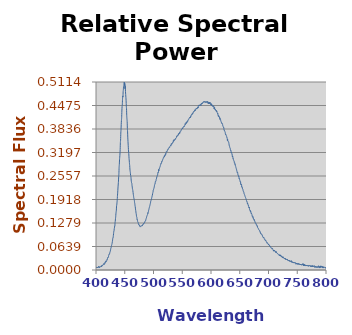
| Category | Scan 719 |
|---|---|
| 349.634 | 0.006 |
| 350.013 | 0.014 |
| 350.392 | 0.012 |
| 350.77 | 0.006 |
| 351.149 | 0.006 |
| 351.527 | 0.014 |
| 351.906 | 0.012 |
| 352.284 | 0.007 |
| 352.663 | 0.008 |
| 353.041 | 0.006 |
| 353.419 | 0.012 |
| 353.798 | 0.014 |
| 354.176 | 0.013 |
| 354.554 | 0.016 |
| 354.932 | 0.013 |
| 355.311 | 0.012 |
| 355.689 | 0.016 |
| 356.067 | 0.011 |
| 356.445 | 0.009 |
| 356.823 | 0.01 |
| 357.201 | 0.011 |
| 357.579 | 0.01 |
| 357.957 | 0.008 |
| 358.335 | 0.015 |
| 358.713 | 0.013 |
| 359.09 | 0.016 |
| 359.468 | 0.016 |
| 359.846 | 0.009 |
| 360.224 | 0.011 |
| 360.601 | 0.011 |
| 360.979 | 0.01 |
| 361.356 | 0.01 |
| 361.734 | 0.014 |
| 362.112 | 0.013 |
| 362.489 | 0.01 |
| 362.866 | 0.013 |
| 363.244 | 0.01 |
| 363.621 | 0.011 |
| 363.999 | 0.01 |
| 364.376 | 0.012 |
| 364.753 | 0.009 |
| 365.13 | 0.005 |
| 365.507 | 0.011 |
| 365.885 | 0.011 |
| 366.262 | 0.012 |
| 366.639 | 0.01 |
| 367.016 | 0.01 |
| 367.393 | 0.007 |
| 367.77 | 0.006 |
| 368.147 | 0.011 |
| 368.524 | 0.013 |
| 368.9 | 0.012 |
| 369.277 | 0.008 |
| 369.654 | 0.007 |
| 370.031 | 0.013 |
| 370.407 | 0.011 |
| 370.784 | 0.01 |
| 371.161 | 0.01 |
| 371.537 | 0.013 |
| 371.914 | 0.013 |
| 372.29 | 0.009 |
| 372.667 | 0.008 |
| 373.043 | 0.008 |
| 373.42 | 0.008 |
| 373.796 | 0.014 |
| 374.172 | 0.011 |
| 374.549 | 0.01 |
| 374.925 | 0.006 |
| 375.301 | 0.01 |
| 375.677 | 0.007 |
| 376.054 | 0.009 |
| 376.43 | 0.006 |
| 376.806 | 0.009 |
| 377.182 | 0.007 |
| 377.558 | 0.009 |
| 377.934 | 0.01 |
| 378.31 | 0.01 |
| 378.686 | 0.011 |
| 379.061 | 0.009 |
| 379.437 | 0.01 |
| 379.813 | 0.008 |
| 380.189 | 0.007 |
| 380.564 | 0.007 |
| 380.94 | 0.009 |
| 381.316 | 0.007 |
| 381.691 | 0.009 |
| 382.067 | 0.008 |
| 382.442 | 0.008 |
| 382.818 | 0.007 |
| 383.193 | 0.009 |
| 383.569 | 0.006 |
| 383.944 | 0.006 |
| 384.319 | 0.005 |
| 384.695 | 0.008 |
| 385.07 | 0.006 |
| 385.445 | 0.008 |
| 385.82 | 0.008 |
| 386.195 | 0.006 |
| 386.571 | 0.009 |
| 386.946 | 0.009 |
| 387.321 | 0.008 |
| 387.696 | 0.006 |
| 388.071 | 0.007 |
| 388.446 | 0.007 |
| 388.82 | 0.006 |
| 389.195 | 0.005 |
| 389.57 | 0.008 |
| 389.945 | 0.007 |
| 390.32 | 0.007 |
| 390.694 | 0.008 |
| 391.069 | 0.007 |
| 391.443 | 0.006 |
| 391.818 | 0.006 |
| 392.193 | 0.007 |
| 392.567 | 0.008 |
| 392.942 | 0.008 |
| 393.316 | 0.007 |
| 393.69 | 0.006 |
| 394.065 | 0.006 |
| 394.439 | 0.004 |
| 394.813 | 0.005 |
| 395.188 | 0.006 |
| 395.562 | 0.006 |
| 395.936 | 0.009 |
| 396.31 | 0.005 |
| 396.684 | 0.005 |
| 397.058 | 0.007 |
| 397.432 | 0.007 |
| 397.806 | 0.008 |
| 398.18 | 0.006 |
| 398.554 | 0.008 |
| 398.928 | 0.009 |
| 399.302 | 0.008 |
| 399.675 | 0.006 |
| 400.049 | 0.008 |
| 400.423 | 0.007 |
| 400.797 | 0.008 |
| 401.17 | 0.006 |
| 401.544 | 0.008 |
| 401.917 | 0.007 |
| 402.291 | 0.008 |
| 402.664 | 0.007 |
| 403.038 | 0.007 |
| 403.411 | 0.006 |
| 403.785 | 0.008 |
| 404.158 | 0.007 |
| 404.531 | 0.01 |
| 404.905 | 0.008 |
| 405.278 | 0.008 |
| 405.651 | 0.009 |
| 406.024 | 0.006 |
| 406.397 | 0.008 |
| 406.77 | 0.009 |
| 407.143 | 0.008 |
| 407.516 | 0.008 |
| 407.889 | 0.009 |
| 408.262 | 0.01 |
| 408.635 | 0.011 |
| 409.008 | 0.011 |
| 409.381 | 0.009 |
| 409.753 | 0.008 |
| 410.126 | 0.013 |
| 410.499 | 0.012 |
| 410.871 | 0.013 |
| 411.244 | 0.012 |
| 411.617 | 0.013 |
| 411.989 | 0.014 |
| 412.362 | 0.014 |
| 412.734 | 0.016 |
| 413.106 | 0.015 |
| 413.479 | 0.017 |
| 413.851 | 0.017 |
| 414.223 | 0.016 |
| 414.596 | 0.015 |
| 414.968 | 0.017 |
| 415.34 | 0.02 |
| 415.712 | 0.018 |
| 416.084 | 0.02 |
| 416.456 | 0.023 |
| 416.829 | 0.021 |
| 417.201 | 0.022 |
| 417.572 | 0.025 |
| 417.944 | 0.023 |
| 418.316 | 0.025 |
| 418.688 | 0.025 |
| 419.06 | 0.028 |
| 419.432 | 0.027 |
| 419.803 | 0.03 |
| 420.175 | 0.032 |
| 420.547 | 0.034 |
| 420.918 | 0.033 |
| 421.29 | 0.034 |
| 421.661 | 0.036 |
| 422.033 | 0.04 |
| 422.404 | 0.041 |
| 422.776 | 0.043 |
| 423.147 | 0.043 |
| 423.519 | 0.046 |
| 423.89 | 0.045 |
| 424.261 | 0.049 |
| 424.632 | 0.05 |
| 425.004 | 0.052 |
| 425.375 | 0.055 |
| 425.746 | 0.059 |
| 426.117 | 0.059 |
| 426.488 | 0.063 |
| 426.859 | 0.065 |
| 427.23 | 0.069 |
| 427.601 | 0.069 |
| 427.972 | 0.072 |
| 428.342 | 0.076 |
| 428.713 | 0.079 |
| 429.084 | 0.085 |
| 429.455 | 0.088 |
| 429.825 | 0.088 |
| 430.196 | 0.094 |
| 430.567 | 0.099 |
| 430.937 | 0.105 |
| 431.308 | 0.105 |
| 431.678 | 0.112 |
| 432.049 | 0.115 |
| 432.419 | 0.12 |
| 432.79 | 0.12 |
| 433.16 | 0.129 |
| 433.53 | 0.133 |
| 433.9 | 0.14 |
| 434.271 | 0.145 |
| 434.641 | 0.153 |
| 435.011 | 0.158 |
| 435.381 | 0.163 |
| 435.751 | 0.174 |
| 436.121 | 0.177 |
| 436.491 | 0.183 |
| 436.861 | 0.189 |
| 437.231 | 0.2 |
| 437.601 | 0.207 |
| 437.971 | 0.217 |
| 438.34 | 0.226 |
| 438.71 | 0.234 |
| 439.08 | 0.242 |
| 439.45 | 0.253 |
| 439.819 | 0.262 |
| 440.189 | 0.279 |
| 440.558 | 0.287 |
| 440.928 | 0.3 |
| 441.297 | 0.307 |
| 441.667 | 0.316 |
| 442.036 | 0.328 |
| 442.406 | 0.347 |
| 442.775 | 0.354 |
| 443.144 | 0.373 |
| 443.513 | 0.382 |
| 443.883 | 0.396 |
| 444.252 | 0.407 |
| 444.621 | 0.415 |
| 444.99 | 0.432 |
| 445.359 | 0.444 |
| 445.728 | 0.449 |
| 446.097 | 0.464 |
| 446.466 | 0.473 |
| 446.835 | 0.471 |
| 447.204 | 0.485 |
| 447.573 | 0.49 |
| 447.941 | 0.498 |
| 448.31 | 0.497 |
| 448.679 | 0.507 |
| 449.047 | 0.511 |
| 449.416 | 0.511 |
| 449.785 | 0.502 |
| 450.153 | 0.507 |
| 450.522 | 0.493 |
| 450.89 | 0.501 |
| 451.258 | 0.486 |
| 451.627 | 0.478 |
| 451.995 | 0.47 |
| 452.363 | 0.46 |
| 452.732 | 0.446 |
| 453.1 | 0.439 |
| 453.468 | 0.42 |
| 453.836 | 0.411 |
| 454.204 | 0.404 |
| 454.572 | 0.385 |
| 454.941 | 0.376 |
| 455.309 | 0.359 |
| 455.676 | 0.349 |
| 456.044 | 0.338 |
| 456.412 | 0.328 |
| 456.78 | 0.32 |
| 457.148 | 0.313 |
| 457.516 | 0.303 |
| 457.883 | 0.297 |
| 458.251 | 0.289 |
| 458.619 | 0.284 |
| 458.986 | 0.275 |
| 459.354 | 0.269 |
| 459.721 | 0.265 |
| 460.089 | 0.258 |
| 460.456 | 0.256 |
| 460.824 | 0.252 |
| 461.191 | 0.245 |
| 461.558 | 0.24 |
| 461.925 | 0.237 |
| 462.293 | 0.235 |
| 462.66 | 0.23 |
| 463.027 | 0.226 |
| 463.394 | 0.221 |
| 463.761 | 0.219 |
| 464.128 | 0.216 |
| 464.495 | 0.211 |
| 464.862 | 0.206 |
| 465.229 | 0.202 |
| 465.596 | 0.197 |
| 465.963 | 0.195 |
| 466.33 | 0.193 |
| 466.696 | 0.189 |
| 467.063 | 0.184 |
| 467.43 | 0.181 |
| 467.796 | 0.176 |
| 468.163 | 0.173 |
| 468.53 | 0.168 |
| 468.896 | 0.163 |
| 469.263 | 0.16 |
| 469.629 | 0.155 |
| 469.995 | 0.153 |
| 470.362 | 0.147 |
| 470.728 | 0.144 |
| 471.094 | 0.143 |
| 471.461 | 0.137 |
| 471.827 | 0.137 |
| 472.193 | 0.134 |
| 472.559 | 0.131 |
| 472.925 | 0.13 |
| 473.291 | 0.129 |
| 473.657 | 0.127 |
| 474.023 | 0.125 |
| 474.389 | 0.123 |
| 474.755 | 0.123 |
| 475.121 | 0.122 |
| 475.487 | 0.121 |
| 475.852 | 0.122 |
| 476.218 | 0.119 |
| 476.584 | 0.118 |
| 476.949 | 0.118 |
| 477.315 | 0.117 |
| 477.68 | 0.118 |
| 478.046 | 0.119 |
| 478.411 | 0.12 |
| 478.777 | 0.12 |
| 479.142 | 0.119 |
| 479.508 | 0.12 |
| 479.873 | 0.121 |
| 480.238 | 0.12 |
| 480.603 | 0.12 |
| 480.969 | 0.123 |
| 481.334 | 0.124 |
| 481.699 | 0.123 |
| 482.064 | 0.124 |
| 482.429 | 0.125 |
| 482.794 | 0.127 |
| 483.159 | 0.126 |
| 483.524 | 0.127 |
| 483.889 | 0.128 |
| 484.254 | 0.129 |
| 484.618 | 0.129 |
| 484.983 | 0.131 |
| 485.348 | 0.133 |
| 485.712 | 0.134 |
| 486.077 | 0.135 |
| 486.442 | 0.134 |
| 486.806 | 0.138 |
| 487.171 | 0.14 |
| 487.535 | 0.141 |
| 487.9 | 0.143 |
| 488.264 | 0.146 |
| 488.628 | 0.148 |
| 488.993 | 0.148 |
| 489.357 | 0.15 |
| 489.721 | 0.151 |
| 490.085 | 0.156 |
| 490.449 | 0.154 |
| 490.814 | 0.158 |
| 491.178 | 0.159 |
| 491.542 | 0.162 |
| 491.906 | 0.164 |
| 492.27 | 0.167 |
| 492.633 | 0.169 |
| 492.997 | 0.172 |
| 493.361 | 0.173 |
| 493.725 | 0.176 |
| 494.089 | 0.178 |
| 494.452 | 0.181 |
| 494.816 | 0.183 |
| 495.18 | 0.187 |
| 495.543 | 0.189 |
| 495.907 | 0.19 |
| 496.27 | 0.191 |
| 496.634 | 0.195 |
| 496.997 | 0.197 |
| 497.36 | 0.199 |
| 497.724 | 0.202 |
| 498.087 | 0.204 |
| 498.45 | 0.207 |
| 498.813 | 0.211 |
| 499.177 | 0.212 |
| 499.54 | 0.217 |
| 499.903 | 0.218 |
| 500.266 | 0.221 |
| 500.629 | 0.221 |
| 500.992 | 0.224 |
| 501.355 | 0.226 |
| 501.718 | 0.23 |
| 502.08 | 0.232 |
| 502.443 | 0.235 |
| 502.806 | 0.235 |
| 503.169 | 0.24 |
| 503.531 | 0.24 |
| 503.894 | 0.241 |
| 504.257 | 0.242 |
| 504.619 | 0.246 |
| 504.982 | 0.248 |
| 505.344 | 0.25 |
| 505.707 | 0.253 |
| 506.069 | 0.254 |
| 506.431 | 0.256 |
| 506.794 | 0.258 |
| 507.156 | 0.259 |
| 507.518 | 0.263 |
| 507.88 | 0.266 |
| 508.242 | 0.266 |
| 508.605 | 0.266 |
| 508.967 | 0.273 |
| 509.329 | 0.27 |
| 509.691 | 0.275 |
| 510.052 | 0.275 |
| 510.414 | 0.276 |
| 510.776 | 0.279 |
| 511.138 | 0.28 |
| 511.5 | 0.282 |
| 511.862 | 0.284 |
| 512.223 | 0.285 |
| 512.585 | 0.288 |
| 512.946 | 0.29 |
| 513.308 | 0.289 |
| 513.67 | 0.291 |
| 514.031 | 0.291 |
| 514.392 | 0.296 |
| 514.754 | 0.295 |
| 515.115 | 0.298 |
| 515.477 | 0.297 |
| 515.838 | 0.299 |
| 516.199 | 0.301 |
| 516.56 | 0.302 |
| 516.921 | 0.304 |
| 517.282 | 0.306 |
| 517.644 | 0.306 |
| 518.005 | 0.306 |
| 518.366 | 0.307 |
| 518.727 | 0.31 |
| 519.087 | 0.308 |
| 519.448 | 0.31 |
| 519.809 | 0.313 |
| 520.17 | 0.311 |
| 520.531 | 0.314 |
| 520.891 | 0.316 |
| 521.252 | 0.314 |
| 521.613 | 0.317 |
| 521.973 | 0.319 |
| 522.334 | 0.322 |
| 522.694 | 0.321 |
| 523.055 | 0.322 |
| 523.415 | 0.322 |
| 523.775 | 0.323 |
| 524.136 | 0.325 |
| 524.496 | 0.327 |
| 524.856 | 0.327 |
| 525.216 | 0.327 |
| 525.577 | 0.329 |
| 525.937 | 0.331 |
| 526.297 | 0.332 |
| 526.657 | 0.331 |
| 527.017 | 0.331 |
| 527.377 | 0.333 |
| 527.737 | 0.335 |
| 528.096 | 0.334 |
| 528.456 | 0.336 |
| 528.816 | 0.337 |
| 529.176 | 0.338 |
| 529.535 | 0.339 |
| 529.895 | 0.338 |
| 530.255 | 0.337 |
| 530.614 | 0.341 |
| 530.974 | 0.343 |
| 531.333 | 0.342 |
| 531.693 | 0.344 |
| 532.052 | 0.342 |
| 532.411 | 0.344 |
| 532.771 | 0.346 |
| 533.13 | 0.346 |
| 533.489 | 0.348 |
| 533.849 | 0.348 |
| 534.208 | 0.348 |
| 534.567 | 0.352 |
| 534.926 | 0.35 |
| 535.285 | 0.351 |
| 535.644 | 0.355 |
| 536.003 | 0.354 |
| 536.362 | 0.353 |
| 536.721 | 0.353 |
| 537.079 | 0.355 |
| 537.438 | 0.357 |
| 537.797 | 0.356 |
| 538.156 | 0.356 |
| 538.514 | 0.359 |
| 538.873 | 0.358 |
| 539.231 | 0.359 |
| 539.59 | 0.36 |
| 539.948 | 0.361 |
| 540.307 | 0.364 |
| 540.665 | 0.362 |
| 541.024 | 0.365 |
| 541.382 | 0.365 |
| 541.74 | 0.366 |
| 542.098 | 0.365 |
| 542.457 | 0.367 |
| 542.815 | 0.367 |
| 543.173 | 0.37 |
| 543.531 | 0.369 |
| 543.889 | 0.371 |
| 544.247 | 0.37 |
| 544.605 | 0.372 |
| 544.963 | 0.371 |
| 545.32 | 0.374 |
| 545.678 | 0.372 |
| 546.036 | 0.374 |
| 546.394 | 0.376 |
| 546.751 | 0.378 |
| 547.109 | 0.379 |
| 547.467 | 0.378 |
| 547.824 | 0.379 |
| 548.182 | 0.38 |
| 548.539 | 0.383 |
| 548.897 | 0.382 |
| 549.254 | 0.383 |
| 549.611 | 0.383 |
| 549.969 | 0.385 |
| 550.326 | 0.387 |
| 550.683 | 0.384 |
| 551.04 | 0.387 |
| 551.397 | 0.387 |
| 551.754 | 0.388 |
| 552.111 | 0.389 |
| 552.468 | 0.389 |
| 552.825 | 0.391 |
| 553.182 | 0.391 |
| 553.539 | 0.39 |
| 553.896 | 0.392 |
| 554.253 | 0.393 |
| 554.61 | 0.395 |
| 554.966 | 0.398 |
| 555.323 | 0.398 |
| 555.68 | 0.396 |
| 556.036 | 0.398 |
| 556.393 | 0.398 |
| 556.749 | 0.402 |
| 557.106 | 0.399 |
| 557.462 | 0.401 |
| 557.818 | 0.4 |
| 558.175 | 0.404 |
| 558.531 | 0.404 |
| 558.887 | 0.403 |
| 559.243 | 0.403 |
| 559.599 | 0.407 |
| 559.956 | 0.408 |
| 560.312 | 0.407 |
| 560.668 | 0.409 |
| 561.024 | 0.41 |
| 561.38 | 0.41 |
| 561.735 | 0.411 |
| 562.091 | 0.413 |
| 562.447 | 0.414 |
| 562.803 | 0.415 |
| 563.159 | 0.414 |
| 563.514 | 0.415 |
| 563.87 | 0.416 |
| 564.225 | 0.414 |
| 564.581 | 0.419 |
| 564.936 | 0.419 |
| 565.292 | 0.418 |
| 565.647 | 0.422 |
| 566.003 | 0.423 |
| 566.358 | 0.424 |
| 566.713 | 0.423 |
| 567.069 | 0.425 |
| 567.424 | 0.425 |
| 567.779 | 0.424 |
| 568.134 | 0.427 |
| 568.489 | 0.426 |
| 568.844 | 0.426 |
| 569.199 | 0.428 |
| 569.554 | 0.431 |
| 569.909 | 0.431 |
| 570.264 | 0.432 |
| 570.619 | 0.431 |
| 570.973 | 0.431 |
| 571.328 | 0.432 |
| 571.683 | 0.435 |
| 572.038 | 0.436 |
| 572.392 | 0.433 |
| 572.747 | 0.435 |
| 573.101 | 0.437 |
| 573.456 | 0.436 |
| 573.81 | 0.439 |
| 574.164 | 0.438 |
| 574.519 | 0.438 |
| 574.873 | 0.441 |
| 575.227 | 0.44 |
| 575.582 | 0.439 |
| 575.936 | 0.439 |
| 576.29 | 0.44 |
| 576.644 | 0.442 |
| 576.998 | 0.443 |
| 577.352 | 0.443 |
| 577.706 | 0.441 |
| 578.06 | 0.446 |
| 578.414 | 0.448 |
| 578.768 | 0.447 |
| 579.121 | 0.448 |
| 579.475 | 0.448 |
| 579.829 | 0.449 |
| 580.182 | 0.449 |
| 580.536 | 0.446 |
| 580.89 | 0.449 |
| 581.243 | 0.45 |
| 581.597 | 0.45 |
| 581.95 | 0.451 |
| 582.303 | 0.449 |
| 582.657 | 0.448 |
| 583.01 | 0.452 |
| 583.363 | 0.453 |
| 583.716 | 0.452 |
| 584.07 | 0.454 |
| 584.423 | 0.454 |
| 584.776 | 0.452 |
| 585.129 | 0.454 |
| 585.482 | 0.455 |
| 585.835 | 0.455 |
| 586.188 | 0.456 |
| 586.541 | 0.457 |
| 586.893 | 0.457 |
| 587.246 | 0.456 |
| 587.599 | 0.459 |
| 587.952 | 0.457 |
| 588.304 | 0.456 |
| 588.657 | 0.458 |
| 589.009 | 0.459 |
| 589.362 | 0.458 |
| 589.714 | 0.458 |
| 590.067 | 0.458 |
| 590.419 | 0.455 |
| 590.772 | 0.456 |
| 591.124 | 0.458 |
| 591.476 | 0.458 |
| 591.828 | 0.459 |
| 592.181 | 0.458 |
| 592.533 | 0.455 |
| 592.885 | 0.457 |
| 593.237 | 0.458 |
| 593.589 | 0.458 |
| 593.941 | 0.459 |
| 594.293 | 0.459 |
| 594.645 | 0.453 |
| 594.996 | 0.457 |
| 595.348 | 0.455 |
| 595.7 | 0.453 |
| 596.052 | 0.452 |
| 596.403 | 0.455 |
| 596.755 | 0.452 |
| 597.106 | 0.455 |
| 597.458 | 0.454 |
| 597.809 | 0.456 |
| 598.161 | 0.453 |
| 598.512 | 0.456 |
| 598.863 | 0.454 |
| 599.215 | 0.45 |
| 599.566 | 0.451 |
| 599.917 | 0.45 |
| 600.268 | 0.449 |
| 600.619 | 0.453 |
| 600.971 | 0.451 |
| 601.322 | 0.447 |
| 601.672 | 0.45 |
| 602.023 | 0.448 |
| 602.374 | 0.447 |
| 602.725 | 0.446 |
| 603.076 | 0.447 |
| 603.427 | 0.444 |
| 603.777 | 0.445 |
| 604.128 | 0.445 |
| 604.479 | 0.447 |
| 604.829 | 0.446 |
| 605.18 | 0.439 |
| 605.53 | 0.441 |
| 605.881 | 0.439 |
| 606.231 | 0.442 |
| 606.582 | 0.438 |
| 606.932 | 0.438 |
| 607.282 | 0.436 |
| 607.632 | 0.437 |
| 607.983 | 0.435 |
| 608.333 | 0.433 |
| 608.683 | 0.433 |
| 609.033 | 0.433 |
| 609.383 | 0.434 |
| 609.733 | 0.431 |
| 610.083 | 0.433 |
| 610.433 | 0.429 |
| 610.783 | 0.428 |
| 611.132 | 0.428 |
| 611.482 | 0.425 |
| 611.832 | 0.426 |
| 612.181 | 0.421 |
| 612.531 | 0.42 |
| 612.881 | 0.418 |
| 613.23 | 0.42 |
| 613.58 | 0.418 |
| 613.929 | 0.419 |
| 614.278 | 0.417 |
| 614.628 | 0.415 |
| 614.977 | 0.416 |
| 615.326 | 0.41 |
| 615.676 | 0.41 |
| 616.025 | 0.412 |
| 616.374 | 0.41 |
| 616.723 | 0.409 |
| 617.072 | 0.405 |
| 617.421 | 0.404 |
| 617.77 | 0.404 |
| 618.119 | 0.401 |
| 618.468 | 0.401 |
| 618.816 | 0.398 |
| 619.165 | 0.399 |
| 619.514 | 0.398 |
| 619.863 | 0.398 |
| 620.211 | 0.395 |
| 620.56 | 0.392 |
| 620.908 | 0.391 |
| 621.257 | 0.389 |
| 621.605 | 0.389 |
| 621.954 | 0.387 |
| 622.302 | 0.387 |
| 622.65 | 0.382 |
| 622.999 | 0.38 |
| 623.347 | 0.38 |
| 623.695 | 0.378 |
| 624.043 | 0.377 |
| 624.391 | 0.376 |
| 624.739 | 0.374 |
| 625.087 | 0.37 |
| 625.435 | 0.368 |
| 625.783 | 0.369 |
| 626.131 | 0.367 |
| 626.479 | 0.366 |
| 626.827 | 0.364 |
| 627.175 | 0.364 |
| 627.522 | 0.362 |
| 627.87 | 0.359 |
| 628.217 | 0.358 |
| 628.565 | 0.352 |
| 628.913 | 0.356 |
| 629.26 | 0.352 |
| 629.607 | 0.351 |
| 629.955 | 0.35 |
| 630.302 | 0.349 |
| 630.649 | 0.349 |
| 630.997 | 0.345 |
| 631.344 | 0.343 |
| 631.691 | 0.338 |
| 632.038 | 0.338 |
| 632.385 | 0.335 |
| 632.732 | 0.333 |
| 633.079 | 0.332 |
| 633.426 | 0.331 |
| 633.773 | 0.328 |
| 634.12 | 0.325 |
| 634.467 | 0.326 |
| 634.813 | 0.323 |
| 635.16 | 0.319 |
| 635.507 | 0.321 |
| 635.853 | 0.318 |
| 636.2 | 0.317 |
| 636.546 | 0.316 |
| 636.893 | 0.312 |
| 637.239 | 0.307 |
| 637.586 | 0.309 |
| 637.932 | 0.309 |
| 638.278 | 0.303 |
| 638.625 | 0.304 |
| 638.971 | 0.3 |
| 639.317 | 0.299 |
| 639.663 | 0.297 |
| 640.009 | 0.296 |
| 640.355 | 0.295 |
| 640.701 | 0.291 |
| 641.047 | 0.291 |
| 641.393 | 0.291 |
| 641.739 | 0.287 |
| 642.085 | 0.287 |
| 642.43 | 0.283 |
| 642.776 | 0.282 |
| 643.122 | 0.281 |
| 643.467 | 0.278 |
| 643.813 | 0.277 |
| 644.159 | 0.274 |
| 644.504 | 0.274 |
| 644.849 | 0.27 |
| 645.195 | 0.268 |
| 645.54 | 0.265 |
| 645.885 | 0.265 |
| 646.231 | 0.266 |
| 646.576 | 0.262 |
| 646.921 | 0.258 |
| 647.266 | 0.258 |
| 647.611 | 0.258 |
| 647.956 | 0.254 |
| 648.301 | 0.256 |
| 648.646 | 0.252 |
| 648.991 | 0.248 |
| 649.336 | 0.249 |
| 649.681 | 0.247 |
| 650.026 | 0.244 |
| 650.37 | 0.243 |
| 650.715 | 0.24 |
| 651.059 | 0.24 |
| 651.404 | 0.24 |
| 651.749 | 0.233 |
| 652.093 | 0.232 |
| 652.438 | 0.234 |
| 652.782 | 0.233 |
| 653.126 | 0.232 |
| 653.471 | 0.226 |
| 653.815 | 0.226 |
| 654.159 | 0.226 |
| 654.503 | 0.223 |
| 654.847 | 0.221 |
| 655.191 | 0.22 |
| 655.535 | 0.219 |
| 655.879 | 0.216 |
| 656.223 | 0.214 |
| 656.567 | 0.213 |
| 656.911 | 0.213 |
| 657.255 | 0.21 |
| 657.599 | 0.208 |
| 657.942 | 0.206 |
| 658.286 | 0.205 |
| 658.629 | 0.204 |
| 658.973 | 0.201 |
| 659.317 | 0.2 |
| 659.66 | 0.199 |
| 660.003 | 0.197 |
| 660.347 | 0.196 |
| 660.69 | 0.194 |
| 661.033 | 0.193 |
| 661.377 | 0.19 |
| 661.72 | 0.189 |
| 662.063 | 0.187 |
| 662.406 | 0.187 |
| 662.749 | 0.186 |
| 663.092 | 0.183 |
| 663.435 | 0.179 |
| 663.778 | 0.181 |
| 664.121 | 0.179 |
| 664.464 | 0.178 |
| 664.807 | 0.177 |
| 665.149 | 0.174 |
| 665.492 | 0.172 |
| 665.835 | 0.172 |
| 666.177 | 0.169 |
| 666.52 | 0.171 |
| 666.862 | 0.167 |
| 667.205 | 0.164 |
| 667.547 | 0.164 |
| 667.89 | 0.163 |
| 668.232 | 0.16 |
| 668.574 | 0.161 |
| 668.916 | 0.158 |
| 669.259 | 0.159 |
| 669.601 | 0.156 |
| 669.943 | 0.154 |
| 670.285 | 0.155 |
| 670.627 | 0.153 |
| 670.969 | 0.151 |
| 671.311 | 0.15 |
| 671.653 | 0.146 |
| 671.994 | 0.147 |
| 672.336 | 0.147 |
| 672.678 | 0.144 |
| 673.019 | 0.145 |
| 673.361 | 0.141 |
| 673.703 | 0.142 |
| 674.044 | 0.139 |
| 674.386 | 0.138 |
| 674.727 | 0.137 |
| 675.069 | 0.138 |
| 675.41 | 0.134 |
| 675.751 | 0.134 |
| 676.092 | 0.133 |
| 676.434 | 0.13 |
| 676.775 | 0.131 |
| 677.116 | 0.128 |
| 677.457 | 0.127 |
| 677.798 | 0.127 |
| 678.139 | 0.125 |
| 678.48 | 0.126 |
| 678.821 | 0.125 |
| 679.162 | 0.122 |
| 679.502 | 0.123 |
| 679.843 | 0.12 |
| 680.184 | 0.121 |
| 680.525 | 0.118 |
| 680.865 | 0.119 |
| 681.206 | 0.115 |
| 681.546 | 0.114 |
| 681.887 | 0.114 |
| 682.227 | 0.112 |
| 682.567 | 0.112 |
| 682.908 | 0.11 |
| 683.248 | 0.11 |
| 683.588 | 0.109 |
| 683.928 | 0.109 |
| 684.269 | 0.107 |
| 684.609 | 0.106 |
| 684.949 | 0.106 |
| 685.289 | 0.104 |
| 685.629 | 0.102 |
| 685.969 | 0.103 |
| 686.308 | 0.099 |
| 686.648 | 0.1 |
| 686.988 | 0.099 |
| 687.328 | 0.097 |
| 687.667 | 0.097 |
| 688.007 | 0.097 |
| 688.347 | 0.096 |
| 688.686 | 0.097 |
| 689.026 | 0.094 |
| 689.365 | 0.095 |
| 689.704 | 0.091 |
| 690.044 | 0.091 |
| 690.383 | 0.091 |
| 690.722 | 0.089 |
| 691.062 | 0.088 |
| 691.401 | 0.089 |
| 691.74 | 0.087 |
| 692.079 | 0.088 |
| 692.418 | 0.086 |
| 692.757 | 0.085 |
| 693.096 | 0.084 |
| 693.435 | 0.084 |
| 693.773 | 0.083 |
| 694.112 | 0.081 |
| 694.451 | 0.081 |
| 694.79 | 0.081 |
| 695.128 | 0.079 |
| 695.467 | 0.08 |
| 695.805 | 0.078 |
| 696.144 | 0.078 |
| 696.482 | 0.076 |
| 696.821 | 0.076 |
| 697.159 | 0.073 |
| 697.497 | 0.073 |
| 697.836 | 0.074 |
| 698.174 | 0.073 |
| 698.512 | 0.073 |
| 698.85 | 0.071 |
| 699.188 | 0.071 |
| 699.526 | 0.07 |
| 699.864 | 0.069 |
| 700.202 | 0.071 |
| 700.54 | 0.069 |
| 700.878 | 0.068 |
| 701.216 | 0.068 |
| 701.553 | 0.066 |
| 701.891 | 0.067 |
| 702.229 | 0.064 |
| 702.566 | 0.064 |
| 702.904 | 0.064 |
| 703.241 | 0.064 |
| 703.579 | 0.064 |
| 703.916 | 0.061 |
| 704.254 | 0.062 |
| 704.591 | 0.061 |
| 704.928 | 0.059 |
| 705.266 | 0.059 |
| 705.603 | 0.058 |
| 705.94 | 0.058 |
| 706.277 | 0.058 |
| 706.614 | 0.059 |
| 706.951 | 0.059 |
| 707.288 | 0.056 |
| 707.625 | 0.055 |
| 707.962 | 0.055 |
| 708.298 | 0.055 |
| 708.635 | 0.052 |
| 708.972 | 0.054 |
| 709.308 | 0.051 |
| 709.645 | 0.054 |
| 709.982 | 0.053 |
| 710.318 | 0.052 |
| 710.655 | 0.053 |
| 710.991 | 0.051 |
| 711.327 | 0.051 |
| 711.664 | 0.05 |
| 712.0 | 0.05 |
| 712.336 | 0.051 |
| 712.672 | 0.049 |
| 713.008 | 0.047 |
| 713.345 | 0.05 |
| 713.681 | 0.048 |
| 714.017 | 0.047 |
| 714.352 | 0.046 |
| 714.688 | 0.046 |
| 715.024 | 0.046 |
| 715.36 | 0.045 |
| 715.696 | 0.045 |
| 716.031 | 0.044 |
| 716.367 | 0.043 |
| 716.703 | 0.043 |
| 717.038 | 0.043 |
| 717.374 | 0.042 |
| 717.709 | 0.042 |
| 718.045 | 0.042 |
| 718.38 | 0.042 |
| 718.715 | 0.039 |
| 719.051 | 0.041 |
| 719.386 | 0.041 |
| 719.721 | 0.039 |
| 720.056 | 0.041 |
| 720.391 | 0.038 |
| 720.726 | 0.04 |
| 721.061 | 0.038 |
| 721.396 | 0.04 |
| 721.731 | 0.038 |
| 722.066 | 0.036 |
| 722.401 | 0.036 |
| 722.735 | 0.037 |
| 723.07 | 0.037 |
| 723.405 | 0.037 |
| 723.739 | 0.035 |
| 724.074 | 0.034 |
| 724.408 | 0.034 |
| 724.743 | 0.035 |
| 725.077 | 0.036 |
| 725.412 | 0.033 |
| 725.746 | 0.033 |
| 726.08 | 0.034 |
| 726.414 | 0.033 |
| 726.748 | 0.032 |
| 727.083 | 0.032 |
| 727.417 | 0.032 |
| 727.751 | 0.032 |
| 728.085 | 0.03 |
| 728.419 | 0.031 |
| 728.752 | 0.032 |
| 729.086 | 0.03 |
| 729.42 | 0.029 |
| 729.754 | 0.031 |
| 730.087 | 0.03 |
| 730.421 | 0.03 |
| 730.755 | 0.028 |
| 731.088 | 0.029 |
| 731.422 | 0.028 |
| 731.755 | 0.029 |
| 732.089 | 0.029 |
| 732.422 | 0.029 |
| 732.755 | 0.027 |
| 733.088 | 0.029 |
| 733.422 | 0.027 |
| 733.755 | 0.026 |
| 734.088 | 0.027 |
| 734.421 | 0.026 |
| 734.754 | 0.025 |
| 735.087 | 0.024 |
| 735.42 | 0.025 |
| 735.753 | 0.026 |
| 736.086 | 0.025 |
| 736.418 | 0.025 |
| 736.751 | 0.026 |
| 737.084 | 0.023 |
| 737.416 | 0.025 |
| 737.749 | 0.023 |
| 738.081 | 0.023 |
| 738.414 | 0.024 |
| 738.746 | 0.024 |
| 739.079 | 0.024 |
| 739.411 | 0.023 |
| 739.743 | 0.025 |
| 740.075 | 0.024 |
| 740.408 | 0.021 |
| 740.74 | 0.023 |
| 741.072 | 0.022 |
| 741.404 | 0.021 |
| 741.736 | 0.021 |
| 742.068 | 0.022 |
| 742.4 | 0.021 |
| 742.732 | 0.02 |
| 743.063 | 0.019 |
| 743.395 | 0.02 |
| 743.727 | 0.021 |
| 744.058 | 0.02 |
| 744.39 | 0.02 |
| 744.722 | 0.019 |
| 745.053 | 0.02 |
| 745.385 | 0.021 |
| 745.716 | 0.02 |
| 746.047 | 0.019 |
| 746.379 | 0.02 |
| 746.71 | 0.02 |
| 747.041 | 0.02 |
| 747.372 | 0.016 |
| 747.703 | 0.016 |
| 748.034 | 0.017 |
| 748.365 | 0.019 |
| 748.696 | 0.017 |
| 749.027 | 0.018 |
| 749.358 | 0.018 |
| 749.689 | 0.016 |
| 750.02 | 0.018 |
| 750.35 | 0.016 |
| 750.681 | 0.017 |
| 751.012 | 0.016 |
| 751.342 | 0.018 |
| 751.673 | 0.015 |
| 752.003 | 0.015 |
| 752.334 | 0.017 |
| 752.664 | 0.018 |
| 752.994 | 0.016 |
| 753.325 | 0.017 |
| 753.655 | 0.015 |
| 753.985 | 0.016 |
| 754.315 | 0.015 |
| 754.645 | 0.014 |
| 754.975 | 0.016 |
| 755.305 | 0.014 |
| 755.635 | 0.015 |
| 755.965 | 0.016 |
| 756.295 | 0.015 |
| 756.625 | 0.014 |
| 756.955 | 0.014 |
| 757.284 | 0.014 |
| 757.614 | 0.013 |
| 757.943 | 0.015 |
| 758.273 | 0.014 |
| 758.602 | 0.014 |
| 758.932 | 0.014 |
| 759.261 | 0.015 |
| 759.591 | 0.014 |
| 759.92 | 0.018 |
| 760.249 | 0.015 |
| 760.578 | 0.013 |
| 760.908 | 0.012 |
| 761.237 | 0.016 |
| 761.566 | 0.015 |
| 761.895 | 0.011 |
| 762.224 | 0.013 |
| 762.553 | 0.012 |
| 762.881 | 0.015 |
| 763.21 | 0.015 |
| 763.539 | 0.014 |
| 763.868 | 0.012 |
| 764.196 | 0.013 |
| 764.525 | 0.012 |
| 764.854 | 0.011 |
| 765.182 | 0.013 |
| 765.51 | 0.011 |
| 765.839 | 0.012 |
| 766.167 | 0.012 |
| 766.496 | 0.012 |
| 766.824 | 0.013 |
| 767.152 | 0.012 |
| 767.48 | 0.013 |
| 767.808 | 0.012 |
| 768.136 | 0.012 |
| 768.464 | 0.012 |
| 768.792 | 0.012 |
| 769.12 | 0.01 |
| 769.448 | 0.012 |
| 769.776 | 0.012 |
| 770.104 | 0.011 |
| 770.431 | 0.011 |
| 770.759 | 0.01 |
| 771.087 | 0.012 |
| 771.414 | 0.013 |
| 771.742 | 0.011 |
| 772.069 | 0.012 |
| 772.397 | 0.012 |
| 772.724 | 0.011 |
| 773.051 | 0.01 |
| 773.379 | 0.009 |
| 773.706 | 0.012 |
| 774.033 | 0.009 |
| 774.36 | 0.01 |
| 774.687 | 0.011 |
| 775.014 | 0.009 |
| 775.341 | 0.01 |
| 775.668 | 0.009 |
| 775.995 | 0.013 |
| 776.322 | 0.009 |
| 776.649 | 0.009 |
| 776.975 | 0.01 |
| 777.302 | 0.011 |
| 777.629 | 0.009 |
| 777.955 | 0.01 |
| 778.282 | 0.01 |
| 778.608 | 0.011 |
| 778.935 | 0.01 |
| 779.261 | 0.009 |
| 779.587 | 0.012 |
| 779.914 | 0.011 |
| 780.24 | 0.01 |
| 780.566 | 0.007 |
| 780.892 | 0.008 |
| 781.218 | 0.008 |
| 781.544 | 0.01 |
| 781.87 | 0.01 |
| 782.196 | 0.009 |
| 782.522 | 0.007 |
| 782.848 | 0.009 |
| 783.174 | 0.008 |
| 783.499 | 0.009 |
| 783.825 | 0.007 |
| 784.151 | 0.009 |
| 784.476 | 0.009 |
| 784.802 | 0.009 |
| 785.127 | 0.007 |
| 785.453 | 0.009 |
| 785.778 | 0.009 |
| 786.103 | 0.007 |
| 786.429 | 0.007 |
| 786.754 | 0.011 |
| 787.079 | 0.011 |
| 787.404 | 0.009 |
| 787.729 | 0.009 |
| 788.054 | 0.008 |
| 788.379 | 0.008 |
| 788.704 | 0.007 |
| 789.029 | 0.005 |
| 789.354 | 0.01 |
| 789.678 | 0.01 |
| 790.003 | 0.008 |
| 790.328 | 0.009 |
| 790.652 | 0.007 |
| 790.977 | 0.011 |
| 791.302 | 0.011 |
| 791.626 | 0.008 |
| 791.951 | 0.008 |
| 792.275 | 0.01 |
| 792.599 | 0.009 |
| 792.923 | 0.007 |
| 793.248 | 0.007 |
| 793.572 | 0.009 |
| 793.896 | 0.007 |
| 794.22 | 0.009 |
| 794.544 | 0.008 |
| 794.868 | 0.005 |
| 795.192 | 0.009 |
| 795.516 | 0.007 |
| 795.84 | 0.006 |
| 796.163 | 0.008 |
| 796.487 | 0.008 |
| 796.811 | 0.007 |
| 797.134 | 0.008 |
| 797.458 | 0.007 |
| 797.781 | 0.007 |
| 798.105 | 0.007 |
| 798.428 | 0.007 |
| 798.752 | 0.007 |
| 799.075 | 0.006 |
| 799.398 | 0.007 |
| 799.721 | 0.006 |
| 800.045 | 0.004 |
| 800.368 | 0.007 |
| 800.691 | 0.005 |
| 801.014 | 0.006 |
| 801.337 | 0.006 |
| 801.66 | 0.007 |
| 801.982 | 0.007 |
| 802.305 | 0.007 |
| 802.628 | 0.006 |
| 802.951 | 0.01 |
| 803.273 | 0.008 |
| 803.596 | 0.009 |
| 803.918 | 0.008 |
| 804.241 | 0.006 |
| 804.563 | 0.008 |
| 804.886 | 0.004 |
| 805.208 | 0.008 |
| 805.53 | 0.006 |
| 805.853 | 0.008 |
| 806.175 | 0.01 |
| 806.497 | 0.008 |
| 806.819 | 0.005 |
| 807.141 | 0.007 |
| 807.463 | 0.006 |
| 807.785 | 0.007 |
| 808.107 | 0.004 |
| 808.429 | 0.009 |
| 808.751 | 0.004 |
| 809.072 | 0.005 |
| 809.394 | 0.006 |
| 809.716 | 0.005 |
| 810.037 | 0.007 |
| 810.359 | 0.006 |
| 810.68 | 0.006 |
| 811.002 | 0.007 |
| 811.323 | 0.006 |
| 811.644 | 0.007 |
| 811.966 | 0.008 |
| 812.287 | 0.007 |
| 812.608 | 0.009 |
| 812.929 | 0.006 |
| 813.25 | 0.008 |
| 813.571 | 0.007 |
| 813.892 | 0.006 |
| 814.213 | 0.005 |
| 814.534 | 0.005 |
| 814.855 | 0.006 |
| 815.176 | 0.007 |
| 815.496 | 0.008 |
| 815.817 | 0.009 |
| 816.138 | 0.008 |
| 816.458 | 0.006 |
| 816.779 | 0.007 |
| 817.099 | 0.008 |
| 817.42 | 0.004 |
| 817.74 | 0.008 |
| 818.06 | 0.003 |
| 818.38 | 0.005 |
| 818.701 | 0.009 |
| 819.021 | 0.009 |
| 819.341 | 0.006 |
| 819.661 | 0.008 |
| 819.981 | 0.004 |
| 820.301 | 0.008 |
| 820.621 | 0.005 |
| 820.941 | 0.008 |
| 821.26 | 0.004 |
| 821.58 | 0.007 |
| 821.9 | 0.008 |
| 822.22 | 0.004 |
| 822.539 | 0.008 |
| 822.859 | 0.007 |
| 823.178 | 0.005 |
| 823.498 | 0.008 |
| 823.817 | 0.005 |
| 824.136 | 0.008 |
| 824.456 | 0.01 |
| 824.775 | 0.008 |
| 825.094 | 0.009 |
| 825.413 | 0.008 |
| 825.732 | 0.007 |
| 826.051 | 0.003 |
| 826.37 | 0.006 |
| 826.689 | 0.008 |
| 827.008 | 0.004 |
| 827.327 | 0.006 |
| 827.646 | 0.008 |
| 827.964 | 0.006 |
| 828.283 | 0.003 |
| 828.602 | 0.008 |
| 828.92 | 0.01 |
| 829.239 | 0.009 |
| 829.557 | 0.006 |
| 829.875 | 0.007 |
| 830.194 | 0.003 |
| 830.512 | 0.008 |
| 830.83 | 0.009 |
| 831.149 | 0.009 |
| 831.467 | 0.006 |
| 831.785 | 0.011 |
| 832.103 | 0.006 |
| 832.421 | 0.008 |
| 832.739 | 0.007 |
| 833.057 | 0.006 |
| 833.375 | 0.005 |
| 833.692 | 0.005 |
| 834.01 | 0.004 |
| 834.328 | 0.005 |
| 834.645 | 0.008 |
| 834.963 | 0.004 |
| 835.28 | 0.007 |
| 835.598 | 0.004 |
| 835.915 | 0.005 |
| 836.233 | 0.005 |
| 836.55 | 0.009 |
| 836.867 | 0.008 |
| 837.184 | 0 |
| 837.502 | 0.003 |
| 837.819 | 0.003 |
| 838.136 | 0.009 |
| 838.453 | 0.007 |
| 838.77 | 0.004 |
| 839.087 | 0.008 |
| 839.404 | 0.013 |
| 839.72 | 0.004 |
| 840.037 | 0.004 |
| 840.354 | 0.011 |
| 840.67 | 0.006 |
| 840.987 | 0.007 |
| 841.303 | 0.004 |
| 841.62 | 0.008 |
| 841.936 | 0.001 |
| 842.253 | 0.006 |
| 842.569 | 0.006 |
| 842.885 | 0.005 |
| 843.202 | 0.001 |
| 843.518 | 0.004 |
| 843.834 | 0.008 |
| 844.15 | 0.009 |
| 844.466 | 0.006 |
| 844.782 | 0.006 |
| 845.098 | 0.009 |
| 845.414 | 0.01 |
| 845.73 | 0.007 |
| 846.045 | 0.008 |
| 846.361 | 0.009 |
| 846.677 | 0.01 |
| 846.992 | 0.011 |
| 847.308 | 0.004 |
| 847.623 | 0.003 |
| 847.939 | 0.007 |
| 848.254 | 0.011 |
| 848.569 | 0.007 |
| 848.885 | 0.01 |
| 849.2 | 0.011 |
| 849.515 | 0.009 |
| 849.83 | 0.006 |
| 850.145 | 0.006 |
| 850.46 | 0.003 |
| 850.775 | 0.011 |
| 851.09 | 0.004 |
| 851.405 | 0.004 |
| 851.72 | 0.007 |
| 852.035 | 0.008 |
| 852.349 | 0.013 |
| 852.664 | 0.008 |
| 852.979 | 0.008 |
| 853.293 | 0.01 |
| 853.608 | 0.003 |
| 853.922 | 0.01 |
| 854.237 | 0.006 |
| 854.551 | 0.008 |
| 854.865 | 0.01 |
| 855.179 | 0.005 |
| 855.494 | 0.009 |
| 855.808 | 0.006 |
| 856.122 | 0.006 |
| 856.436 | 0.007 |
| 856.75 | 0.011 |
| 857.064 | 0.01 |
| 857.378 | 0.006 |
| 857.691 | 0.003 |
| 858.005 | 0.003 |
| 858.319 | 0.008 |
| 858.633 | 0.008 |
| 858.946 | 0.005 |
| 859.26 | 0.002 |
| 859.573 | 0.006 |
| 859.887 | 0.006 |
| 860.2 | 0.008 |
| 860.513 | 0.006 |
| 860.827 | 0.006 |
| 861.14 | 0.012 |
| 861.453 | 0.007 |
| 861.766 | 0.012 |
| 862.079 | 0.009 |
| 862.392 | 0.009 |
| 862.705 | 0.004 |
| 863.018 | 0.009 |
| 863.331 | 0.015 |
| 863.644 | 0.005 |
| 863.957 | 0.008 |
| 864.269 | 0.006 |
| 864.582 | 0.004 |
| 864.895 | 0.005 |
| 865.207 | 0.012 |
| 865.52 | 0.006 |
| 865.832 | 0.009 |
| 866.145 | 0.011 |
| 866.457 | 0.013 |
| 866.769 | 0.006 |
| 867.081 | 0.012 |
| 867.394 | 0.008 |
| 867.706 | 0.006 |
| 868.018 | 0.004 |
| 868.33 | 0.009 |
| 868.642 | 0.008 |
| 868.954 | 0.003 |
| 869.266 | 0.012 |
| 869.577 | 0.008 |
| 869.889 | 0.007 |
| 870.201 | 0.007 |
| 870.512 | 0.007 |
| 870.824 | 0.008 |
| 871.136 | 0.005 |
| 871.447 | 0.012 |
| 871.758 | 0.01 |
| 872.07 | 0.014 |
| 872.381 | 0.006 |
| 872.693 | 0.011 |
| 873.004 | 0.011 |
| 873.315 | 0.003 |
| 873.626 | 0.006 |
| 873.937 | 0.015 |
| 874.248 | 0.012 |
| 874.559 | 0.007 |
| 874.87 | 0.01 |
| 875.181 | 0.003 |
| 875.492 | 0.012 |
| 875.802 | 0.004 |
| 876.113 | 0.005 |
| 876.424 | 0.018 |
| 876.734 | 0.013 |
| 877.045 | 0.012 |
| 877.355 | 0.007 |
| 877.666 | 0.009 |
| 877.976 | 0.014 |
| 878.286 | 0.002 |
| 878.597 | 0.012 |
| 878.907 | 0.009 |
| 879.217 | 0.006 |
| 879.527 | 0.016 |
| 879.837 | 0.013 |
| 880.147 | 0.004 |
| 880.457 | 0.009 |
| 880.767 | 0.02 |
| 881.077 | 0.01 |
| 881.387 | 0.013 |
| 881.696 | 0.005 |
| 882.006 | 0.008 |
| 882.316 | 0.018 |
| 882.625 | 0.009 |
| 882.935 | 0.012 |
| 883.244 | 0.016 |
| 883.554 | 0.011 |
| 883.863 | 0.015 |
| 884.172 | 0.007 |
| 884.482 | 0.012 |
| 884.791 | 0.011 |
| 885.1 | 0.006 |
| 885.409 | 0.018 |
| 885.718 | 0.002 |
| 886.027 | 0.02 |
| 886.336 | 0.011 |
| 886.645 | 0.012 |
| 886.954 | 0.005 |
| 887.262 | 0.005 |
| 887.571 | 0.015 |
| 887.88 | 0.007 |
| 888.188 | 0.016 |
| 888.497 | 0.003 |
| 888.805 | 0.013 |
| 889.114 | 0.011 |
| 889.422 | 0.015 |
| 889.731 | 0.01 |
| 890.039 | 0.01 |
| 890.347 | 0.011 |
| 890.655 | 0.01 |
| 890.963 | 0.009 |
| 891.271 | 0.012 |
| 891.579 | 0.006 |
| 891.887 | 0.005 |
| 892.195 | 0.009 |
| 892.503 | 0.011 |
| 892.811 | 0.008 |
| 893.119 | 0.01 |
| 893.426 | 0.015 |
| 893.734 | 0.009 |
| 894.042 | 0.015 |
| 894.349 | 0.006 |
| 894.657 | 0.008 |
| 894.964 | 0.007 |
| 895.271 | 0.009 |
| 895.579 | 0.007 |
| 895.886 | 0.004 |
| 896.193 | 0.008 |
| 896.5 | 0.014 |
| 896.807 | 0.006 |
| 897.115 | 0.022 |
| 897.422 | 0.009 |
| 897.728 | 0.008 |
| 898.035 | 0.003 |
| 898.342 | 0.005 |
| 898.649 | 0.016 |
| 898.956 | 0.016 |
| 899.262 | 0.011 |
| 899.569 | 0.008 |
| 899.875 | 0.002 |
| 900.182 | 0.011 |
| 900.488 | 0.012 |
| 900.795 | 0.011 |
| 901.101 | 0.009 |
| 901.407 | 0.012 |
| 901.714 | 0.016 |
| 902.02 | 0.01 |
| 902.326 | 0.012 |
| 902.632 | 0.005 |
| 902.938 | 0.012 |
| 903.244 | 0.009 |
| 903.55 | 0.013 |
| 903.856 | 0.014 |
| 904.162 | 0.012 |
| 904.467 | 0.012 |
| 904.773 | 0.007 |
| 905.079 | 0.019 |
| 905.384 | 0.009 |
| 905.69 | 0.014 |
| 905.995 | 0.012 |
| 906.301 | 0.002 |
| 906.606 | 0.012 |
| 906.911 | 0.014 |
| 907.217 | 0.01 |
| 907.522 | 0.007 |
| 907.827 | 0.011 |
| 908.132 | 0.014 |
| 908.437 | 0.018 |
| 908.742 | 0.01 |
| 909.047 | 0.011 |
| 909.352 | 0.019 |
| 909.657 | 0.014 |
| 909.961 | 0.007 |
| 910.266 | 0.013 |
| 910.571 | 0.015 |
| 910.875 | 0.011 |
| 911.18 | 0.021 |
| 911.484 | 0.013 |
| 911.789 | 0.003 |
| 912.093 | 0 |
| 912.398 | 0.001 |
| 912.702 | 0.013 |
| 913.006 | 0.009 |
| 913.31 | 0.005 |
| 913.614 | 0.005 |
| 913.918 | 0.013 |
| 914.222 | 0.011 |
| 914.526 | 0.005 |
| 914.83 | 0.013 |
| 915.134 | 0.01 |
| 915.438 | 0.01 |
| 915.742 | 0.017 |
| 916.045 | 0.012 |
| 916.349 | 0.014 |
| 916.652 | 0.019 |
| 916.956 | 0.013 |
| 917.259 | 0.022 |
| 917.563 | 0.011 |
| 917.866 | 0.031 |
| 918.169 | 0.019 |
| 918.473 | 0.018 |
| 918.776 | 0.008 |
| 919.079 | 0.01 |
| 919.382 | 0.011 |
| 919.685 | 0.009 |
| 919.988 | 0.007 |
| 920.291 | 0.001 |
| 920.594 | 0.018 |
| 920.896 | 0.014 |
| 921.199 | 0.009 |
| 921.502 | 0.011 |
| 921.805 | 0.013 |
| 922.107 | 0.005 |
| 922.41 | 0.024 |
| 922.712 | 0.016 |
| 923.015 | 0.024 |
| 923.317 | 0.012 |
| 923.619 | 0.011 |
| 923.921 | 0.014 |
| 924.224 | 0.021 |
| 924.526 | 0.015 |
| 924.828 | 0.011 |
| 925.13 | 0.016 |
| 925.432 | 0.016 |
| 925.734 | -0.001 |
| 926.036 | 0.022 |
| 926.337 | 0.016 |
| 926.639 | 0.022 |
| 926.941 | 0.009 |
| 927.242 | 0.012 |
| 927.544 | 0.013 |
| 927.846 | 0.021 |
| 928.147 | 0.009 |
| 928.448 | 0.026 |
| 928.75 | 0.016 |
| 929.051 | 0.015 |
| 929.352 | -0.005 |
| 929.654 | 0.023 |
| 929.955 | 0.008 |
| 930.256 | 0.022 |
| 930.557 | 0.024 |
| 930.858 | 0.018 |
| 931.159 | 0.028 |
| 931.46 | 0.015 |
| 931.76 | 0.023 |
| 932.061 | 0.024 |
| 932.362 | 0.037 |
| 932.663 | 0.015 |
| 932.963 | 0.007 |
| 933.264 | 0.015 |
| 933.564 | 0.022 |
| 933.865 | 0.03 |
| 934.165 | 0.001 |
| 934.465 | 0.031 |
| 934.766 | 0.008 |
| 935.066 | 0.035 |
| 935.366 | 0.015 |
| 935.666 | 0.014 |
| 935.966 | 0.02 |
| 936.266 | 0.034 |
| 936.566 | 0.041 |
| 936.866 | -0.002 |
| 937.166 | 0.03 |
| 937.465 | 0.03 |
| 937.765 | 0.044 |
| 938.065 | 0.057 |
| 938.364 | 0.052 |
| 938.664 | 0.036 |
| 938.963 | 0.06 |
| 939.263 | 0.019 |
| 939.562 | 0.039 |
| 939.861 | 0.053 |
| 940.161 | 0.023 |
| 940.46 | 0.054 |
| 940.759 | 0.077 |
| 941.058 | 0.064 |
| 941.357 | 0.039 |
| 941.656 | 0.026 |
| 941.955 | 0.054 |
| 942.254 | 0.067 |
| 942.553 | 0.05 |
| 942.852 | 0.116 |
| 943.15 | 0.09 |
| 943.449 | 0.11 |
| 943.747 | 0.061 |
| 944.046 | 0.077 |
| 944.344 | 0.051 |
| 944.643 | 0.139 |
| 944.941 | 0.111 |
| 945.24 | 0.036 |
| 945.538 | 0.125 |
| 945.836 | 0.093 |
| 946.134 | 0.091 |
| 946.432 | 0.087 |
| 946.73 | 0.128 |
| 947.028 | 0.007 |
| 947.326 | 0.072 |
| 947.624 | 0.027 |
| 947.922 | 0.075 |
| 948.22 | 0.037 |
| 948.517 | 0.046 |
| 948.815 | 0.098 |
| 949.112 | -0.009 |
| 949.41 | 0.055 |
| 949.708 | 0.062 |
| 950.005 | 0.055 |
| 950.302 | 0.067 |
| 950.6 | 0.082 |
| 950.897 | 0.057 |
| 951.194 | 0.028 |
| 951.491 | 0.075 |
| 951.788 | -0.011 |
| 952.085 | 0.019 |
| 952.382 | 0.109 |
| 952.679 | 0.042 |
| 952.976 | 0.07 |
| 953.273 | 0.052 |
| 953.57 | 0.045 |
| 953.866 | 0.042 |
| 954.163 | 0.043 |
| 954.459 | 0.037 |
| 954.756 | 0.037 |
| 955.052 | 0.055 |
| 955.349 | 0.015 |
| 955.645 | 0.03 |
| 955.941 | 0.018 |
| 956.238 | 0.053 |
| 956.534 | 0.063 |
| 956.83 | 0.035 |
| 957.126 | 0.038 |
| 957.422 | 0.045 |
| 957.718 | 0.032 |
| 958.014 | 0.104 |
| 958.31 | 0.029 |
| 958.606 | 0.052 |
| 958.901 | 0.045 |
| 959.197 | 0.045 |
| 959.493 | 0.039 |
| 959.788 | 0.042 |
| 960.084 | 0.047 |
| 960.379 | 0.065 |
| 960.674 | 0.044 |
| 960.97 | 0.04 |
| 961.265 | 0.017 |
| 961.56 | -0.028 |
| 961.856 | 0.075 |
| 962.151 | 0.032 |
| 962.446 | -0.003 |
| 962.741 | 0.041 |
| 963.036 | 0.069 |
| 963.331 | 0.052 |
| 963.625 | 0.04 |
| 963.92 | 0.026 |
| 964.215 | 0.061 |
| 964.51 | 0.034 |
| 964.804 | 0.042 |
| 965.099 | -0.01 |
| 965.393 | 0.026 |
| 965.688 | 0.093 |
| 965.982 | 0.027 |
| 966.276 | 0.044 |
| 966.571 | 0.029 |
| 966.865 | 0.06 |
| 967.159 | 0.046 |
| 967.453 | 0.073 |
| 967.747 | 0.058 |
| 968.041 | 0.055 |
| 968.335 | 0.053 |
| 968.629 | 0.073 |
| 968.923 | 0.039 |
| 969.216 | 0.034 |
| 969.51 | 0.058 |
| 969.804 | 0.087 |
| 970.097 | -0.001 |
| 970.391 | 0.07 |
| 970.684 | 0.068 |
| 970.978 | -0.015 |
| 971.271 | 0.069 |
| 971.564 | 0.034 |
| 971.858 | 0.038 |
| 972.151 | 0.025 |
| 972.444 | 0.045 |
| 972.737 | 0.07 |
| 973.03 | 0.049 |
| 973.323 | 0.041 |
| 973.616 | 0.081 |
| 973.909 | 0.012 |
| 974.201 | 0.105 |
| 974.494 | 0.079 |
| 974.787 | 0.06 |
| 975.08 | 0.083 |
| 975.372 | 0.075 |
| 975.665 | 0.087 |
| 975.957 | 0.056 |
| 976.249 | 0.024 |
| 976.542 | 0.034 |
| 976.834 | 0.059 |
| 977.126 | 0.08 |
| 977.418 | 0.086 |
| 977.711 | 0.043 |
| 978.003 | 0.083 |
| 978.295 | 0.037 |
| 978.586 | 0.072 |
| 978.878 | 0.059 |
| 979.17 | 0.072 |
| 979.462 | 0.038 |
| 979.754 | 0.01 |
| 980.045 | 0.017 |
| 980.337 | 0.026 |
| 980.628 | 0.037 |
| 980.92 | 0.061 |
| 981.211 | 0.011 |
| 981.503 | 0.012 |
| 981.794 | 0.062 |
| 982.085 | 0.012 |
| 982.376 | 0.03 |
| 982.668 | 0.057 |
| 982.959 | 0.024 |
| 983.25 | 0.13 |
| 983.541 | 0.076 |
| 983.832 | 0.022 |
| 984.122 | 0.06 |
| 984.413 | 0.037 |
| 984.704 | 0.107 |
| 984.995 | 0.065 |
| 985.285 | 0.043 |
| 985.576 | -0.025 |
| 985.866 | 0.093 |
| 986.157 | 0.049 |
| 986.447 | 0.04 |
| 986.737 | 0.081 |
| 987.028 | 0.039 |
| 987.318 | 0.057 |
| 987.608 | 0.04 |
| 987.898 | 0.081 |
| 988.188 | 0.12 |
| 988.478 | 0.02 |
| 988.768 | 0.051 |
| 989.058 | 0.124 |
| 989.348 | 0.053 |
| 989.638 | 0.097 |
| 989.927 | 0.07 |
| 990.217 | 0.061 |
| 990.506 | 0.074 |
| 990.796 | 0.067 |
| 991.086 | 0.129 |
| 991.375 | 0.109 |
| 991.664 | 0.15 |
| 991.954 | 0.121 |
| 992.243 | 0.016 |
| 992.532 | 0.036 |
| 992.821 | 0.104 |
| 993.11 | 0.078 |
| 993.399 | 0.155 |
| 993.688 | -0.008 |
| 993.977 | 0.011 |
| 994.266 | 0.1 |
| 994.555 | 0.098 |
| 994.843 | 0.032 |
| 995.132 | 0.112 |
| 995.421 | -0.001 |
| 995.709 | 0.089 |
| 995.998 | 0.071 |
| 996.286 | 0.081 |
| 996.574 | 0.114 |
| 996.863 | 0.02 |
| 997.151 | 0.073 |
| 997.439 | 0.103 |
| 997.727 | 0.022 |
| 998.015 | 0.074 |
| 998.303 | 0.08 |
| 998.591 | 0.166 |
| 998.879 | 0.093 |
| 999.167 | 0.012 |
| 999.455 | 0.041 |
| 999.743 | 0.11 |
| 1000.03 | 0.18 |
| 1000.318 | 0.135 |
| 1000.606 | 0.033 |
| 1000.893 | 0.057 |
| 1001.181 | 0.081 |
| 1001.468 | 0.082 |
| 1001.755 | 0.11 |
| 1002.043 | 0.057 |
| 1002.33 | 0.092 |
| 1002.617 | 0.084 |
| 1002.904 | 0.092 |
| 1003.191 | 0.158 |
| 1003.478 | 0.089 |
| 1003.765 | 0.061 |
| 1004.052 | 0.122 |
| 1004.339 | 0.071 |
| 1004.625 | 0.113 |
| 1004.912 | 0.192 |
| 1005.199 | 0.088 |
| 1005.485 | 0.111 |
| 1005.772 | 0.181 |
| 1006.058 | 0.054 |
| 1006.345 | 0.071 |
| 1006.631 | 0.072 |
| 1006.917 | 0.109 |
| 1007.204 | 0.08 |
| 1007.49 | 0.178 |
| 1007.776 | 0.129 |
| 1008.062 | 0.141 |
| 1008.348 | 0.093 |
| 1008.634 | 0.163 |
| 1008.92 | -0.003 |
| 1009.206 | 0.2 |
| 1009.491 | 0.092 |
| 1009.777 | 0.082 |
| 1010.063 | 0.051 |
| 1010.348 | 0.071 |
| 1010.634 | 0.068 |
| 1010.919 | 0.178 |
| 1011.205 | 0.079 |
| 1011.49 | 0.074 |
| 1011.775 | 0.129 |
| 1012.061 | 0.245 |
| 1012.346 | 0.085 |
| 1012.631 | 0.129 |
| 1012.916 | 0.299 |
| 1013.201 | 0.27 |
| 1013.486 | 0.212 |
| 1013.771 | 0.061 |
| 1014.056 | 0.112 |
| 1014.34 | 0.091 |
| 1014.625 | 0.234 |
| 1014.91 | 0.108 |
| 1015.194 | 0.034 |
| 1015.479 | 0.059 |
| 1015.763 | 0.156 |
| 1016.048 | 0.105 |
| 1016.332 | 0.224 |
| 1016.616 | 0.143 |
| 1016.901 | 0.18 |
| 1017.185 | 0.079 |
| 1017.469 | 0.092 |
| 1017.753 | 0.168 |
| 1018.037 | 0.075 |
| 1018.321 | 0.155 |
| 1018.605 | 0.091 |
| 1018.889 | 0.204 |
| 1019.173 | 0.177 |
| 1019.456 | 0.077 |
| 1019.74 | 0.156 |
| 1020.023 | 0.277 |
| 1020.307 | 0.319 |
| 1020.591 | 0.027 |
| 1020.874 | -0.045 |
| 1021.157 | 0.298 |
| 1021.441 | 0.166 |
| 1021.724 | 0.183 |
| 1022.007 | 0.22 |
| 1022.29 | 0.24 |
| 1022.573 | 0.27 |
| 1022.856 | 0.118 |